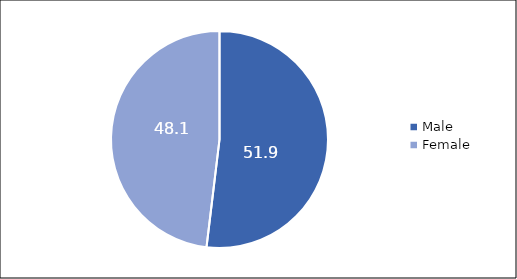
| Category | Series 0 |
|---|---|
| Male | 51.908 |
| Female | 48.092 |